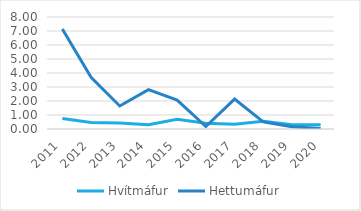
| Category | Hvítmáfur | Hettumáfur |
|---|---|---|
| 2011.0 | 0.756 | 7.143 |
| 2012.0 | 0.462 | 3.695 |
| 2013.0 | 0.434 | 1.644 |
| 2014.0 | 0.306 | 2.81 |
| 2015.0 | 0.701 | 2.066 |
| 2016.0 | 0.417 | 0.179 |
| 2017.0 | 0.334 | 2.139 |
| 2018.0 | 0.56 | 0.51 |
| 2019.0 | 0.305 | 0.167 |
| 2020.0 | 0.305 | 0.034 |